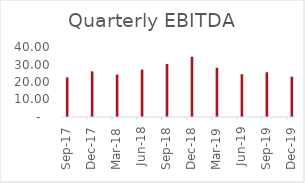
| Category | Operating Profit |
|---|---|
| 2017-09-30 | 22.62 |
| 2017-12-31 | 26.09 |
| 2018-03-31 | 24.24 |
| 2018-06-30 | 27.06 |
| 2018-09-30 | 30.32 |
| 2018-12-31 | 34.49 |
| 2019-03-31 | 28.15 |
| 2019-06-30 | 24.46 |
| 2019-09-30 | 25.58 |
| 2019-12-31 | 23 |